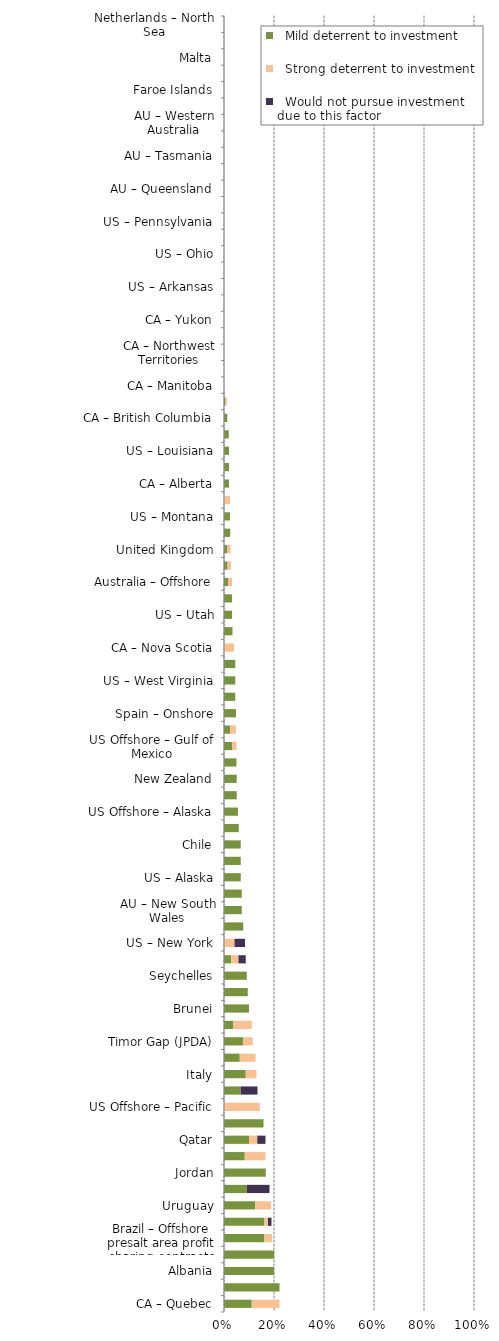
| Category |   Mild deterrent to investment |   Strong deterrent to investment |   Would not pursue investment due to this factor |
|---|---|---|---|
| CA – Quebec | 0.111 | 0.111 | 0 |
| Romania | 0.222 | 0 | 0 |
| Albania | 0.2 | 0 | 0 |
| Botswana | 0.2 | 0 | 0 |
| Brazil – Offshore presalt area profit sharing contracts | 0.161 | 0.032 | 0 |
| Malaysia | 0.162 | 0.014 | 0.014 |
| Uruguay | 0.125 | 0.063 | 0 |
| Greece | 0.091 | 0 | 0.091 |
| Jordan | 0.167 | 0 | 0 |
| Hungary | 0.083 | 0.083 | 0 |
| Qatar | 0.1 | 0.033 | 0.033 |
| Namibia | 0.158 | 0 | 0 |
| US Offshore – Pacific | 0 | 0.143 | 0 |
| Kuwait | 0.067 | 0 | 0.067 |
| Italy | 0.087 | 0.043 | 0 |
| Ireland | 0.063 | 0.063 | 0 |
| Timor Gap (JPDA) | 0.077 | 0.038 | 0 |
| Oman | 0.037 | 0.074 | 0 |
| Brunei | 0.1 | 0 | 0 |
| Spain – Offshore | 0.095 | 0 | 0 |
| Seychelles | 0.091 | 0 | 0 |
| United Arab Emirates | 0.029 | 0.029 | 0.029 |
| US – New York | 0 | 0.042 | 0.042 |
| Greenland | 0.077 | 0 | 0 |
| AU – New South Wales | 0.071 | 0 | 0 |
| Poland | 0.071 | 0 | 0 |
| US – Alaska | 0.067 | 0 | 0 |
| Japan | 0.067 | 0 | 0 |
| Chile | 0.067 | 0 | 0 |
| Germany | 0.059 | 0 | 0 |
| US Offshore – Alaska | 0.056 | 0 | 0 |
| US – California | 0.051 | 0 | 0 |
| New Zealand | 0.051 | 0 | 0 |
| US – Illinois | 0.05 | 0 | 0 |
| US Offshore – Gulf of Mexico | 0.033 | 0.017 | 0 |
| Norway – North Sea | 0.024 | 0.024 | 0 |
| Spain – Onshore | 0.048 | 0 | 0 |
| US – Michigan | 0.045 | 0 | 0 |
| US – West Virginia | 0.045 | 0 | 0 |
| France | 0.045 | 0 | 0 |
| CA – Nova Scotia | 0 | 0.04 | 0 |
| US – Colorado | 0.034 | 0 | 0 |
| US – Utah | 0.032 | 0 | 0 |
| US – Wyoming | 0.032 | 0 | 0 |
| Australia – Offshore | 0.016 | 0.016 | 0 |
| United Kingdom – North Sea | 0.014 | 0.014 | 0 |
| United Kingdom | 0.013 | 0.013 | 0 |
| US – New Mexico | 0.025 | 0 | 0 |
| US – Montana | 0.024 | 0 | 0 |
| Norway | 0 | 0.024 | 0 |
| CA – Alberta | 0.02 | 0 | 0 |
| US – Kansas | 0.02 | 0 | 0 |
| US – Louisiana | 0.02 | 0 | 0 |
| US – North Dakota | 0.019 | 0 | 0 |
| CA – British Columbia | 0.013 | 0 | 0 |
| US – Texas | 0.006 | 0.006 | 0 |
| CA – Manitoba | 0 | 0 | 0 |
| CA – Newfoundland & Labrador | 0 | 0 | 0 |
| CA – Northwest Territories | 0 | 0 | 0 |
| CA – Saskatchewan | 0 | 0 | 0 |
| CA – Yukon | 0 | 0 | 0 |
| US – Alabama | 0 | 0 | 0 |
| US – Arkansas | 0 | 0 | 0 |
| US – Mississippi | 0 | 0 | 0 |
| US – Ohio | 0 | 0 | 0 |
| US – Oklahoma | 0 | 0 | 0 |
| US – Pennsylvania | 0 | 0 | 0 |
| AU – Northern Territory | 0 | 0 | 0 |
| AU – Queensland | 0 | 0 | 0 |
| AU – South Australia | 0 | 0 | 0 |
| AU – Tasmania | 0 | 0 | 0 |
| AU – Victoria | 0 | 0 | 0 |
| AU – Western Australia | 0 | 0 | 0 |
| Denmark | 0 | 0 | 0 |
| Faroe Islands | 0 | 0 | 0 |
| Georgia | 0 | 0 | 0 |
| Malta | 0 | 0 | 0 |
| Netherlands | 0 | 0 | 0 |
| Netherlands – North Sea | 0 | 0 | 0 |